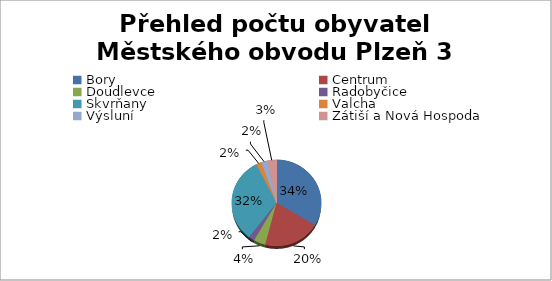
| Category | Přehled počtu obyvatel Městského obvodu Plzeň 3 |
|---|---|
| Bory | 15720 |
| Centrum | 9570 |
| Doudlevce | 2000 |
| Radobyčice | 1000 |
| Skvrňany | 15000 |
| Valcha | 883 |
| Výsluní | 1000 |
| Zátiší a Nová Hospoda | 1600 |